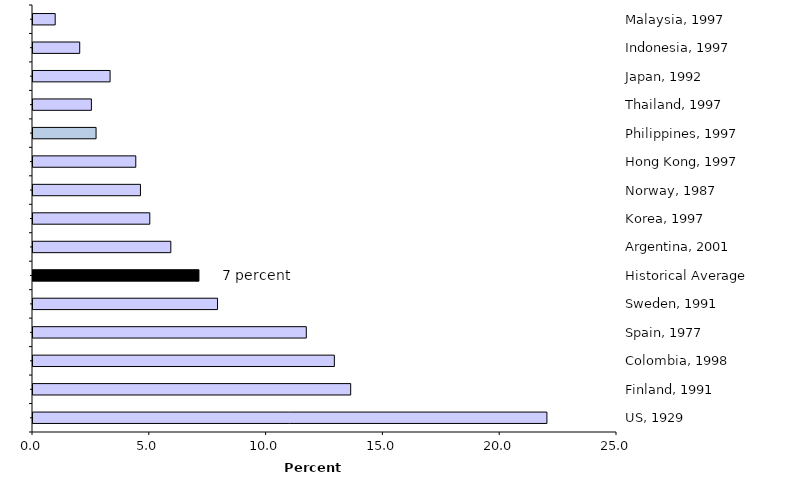
| Category | Series 0 |
|---|---|
| US, 1929 | 22 |
| Finland, 1991 | 13.6 |
| Colombia, 1998 | 12.9 |
| Spain, 1977 | 11.7 |
| Sweden, 1991 | 7.9 |
| Historical Average | 7.104 |
| Argentina, 2001 | 5.9 |
| Korea, 1997 | 5 |
| Norway, 1987 | 4.6 |
| Hong Kong, 1997 | 4.4 |
| Philippines, 1997 | 2.7 |
| Thailand, 1997 | 2.5 |
| Japan, 1992 | 3.3 |
| Indonesia, 1997 | 2 |
| Malaysia, 1997 | 0.95 |